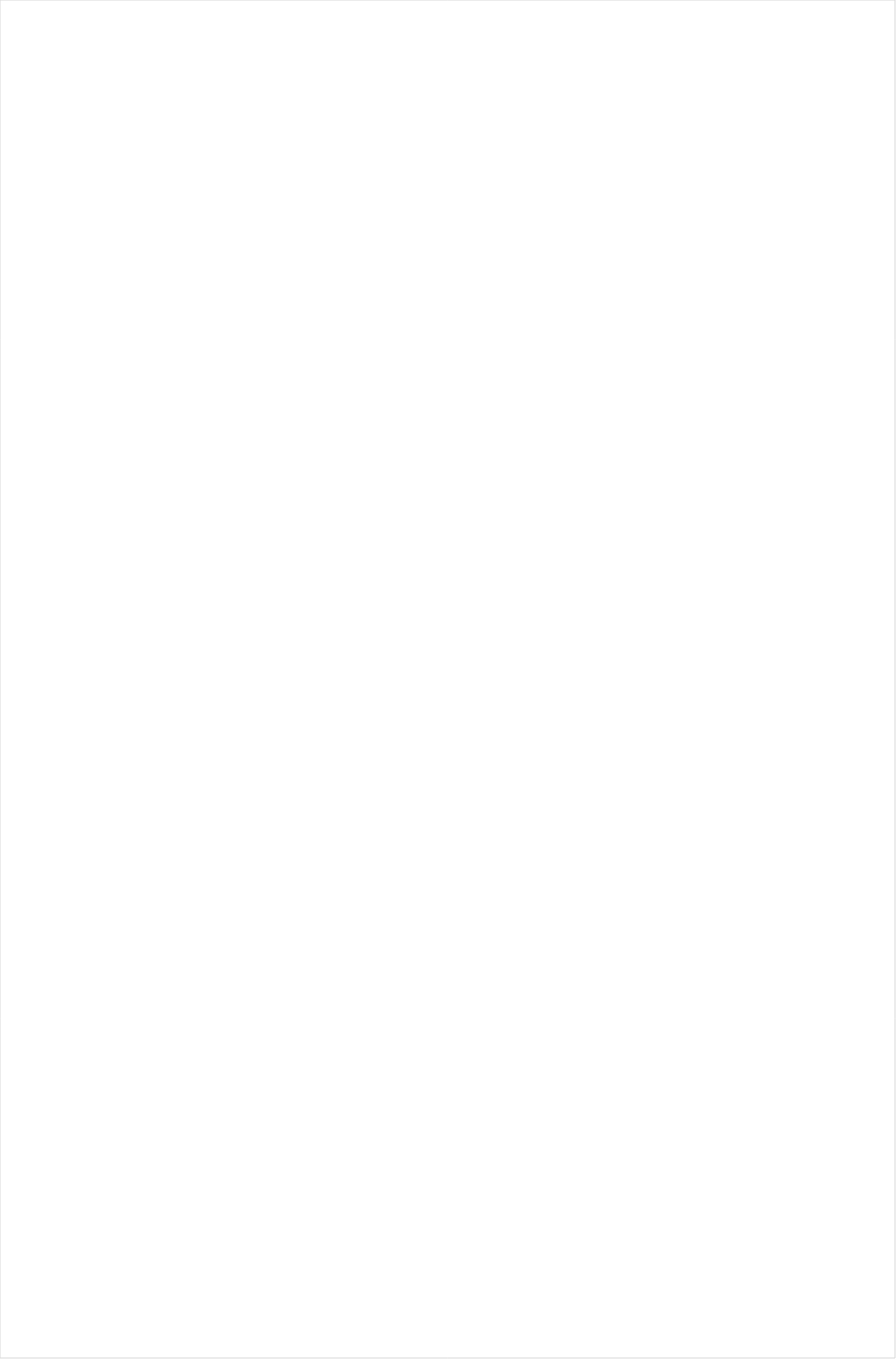
| Category | Total |
|---|---|
| Galavision | -0.847 |
| UniMas | -0.836 |
| TUDN | -0.761 |
| Telemundo | -0.749 |
| ESPN Deportes | -0.686 |
| Univision | -0.559 |
| NBC Universo | -0.513 |
| Cartoon Network | -0.419 |
| Travel | -0.263 |
| Adult Swim | -0.248 |
| Discovery Life Channel | -0.245 |
| Nick Toons | -0.224 |
| Lifetime Movies | -0.185 |
| Nick | -0.174 |
| Disney Channel | -0.165 |
| Investigation Discovery | -0.154 |
| Disney XD | -0.145 |
| TLC | -0.138 |
| INSP | -0.136 |
| Hallmark Movies & Mysteries | -0.134 |
| UP TV | -0.133 |
| Nick Jr. | -0.123 |
| Teen Nick | -0.116 |
| OXYGEN | -0.115 |
| WE TV | -0.114 |
| Universal Kids | -0.111 |
| ION | -0.103 |
| Lifetime | -0.095 |
| Science Channel | -0.091 |
| Hallmark | -0.09 |
| VH1 | -0.088 |
| Oprah Winfrey Network | -0.08 |
| Nick@Nite | -0.072 |
| Disney Junior US | -0.072 |
| Headline News | -0.069 |
| BET | -0.032 |
| E! | -0.03 |
| Motor Trend Network | -0.029 |
| Animal Planet | -0.026 |
| MyNetworkTV | 0.008 |
| A&E | 0.01 |
| Discovery Family Channel | 0.023 |
| History Channel | 0.024 |
| RFD TV | 0.039 |
| SYFY | 0.042 |
| MTV | 0.051 |
| Great American Country | 0.056 |
| BET Her | 0.059 |
| TV ONE | 0.06 |
| National Geographic Wild | 0.06 |
| FYI | 0.061 |
| CW | 0.062 |
| CMTV | 0.066 |
| POP | 0.067 |
| Discovery Channel | 0.068 |
| BRAVO | 0.068 |
| Ovation | 0.081 |
| American Heroes Channel | 0.082 |
| FOX | 0.083 |
| TV LAND | 0.087 |
| USA Network | 0.088 |
| Freeform | 0.094 |
| Logo | 0.094 |
| Paramount Network | 0.101 |
| MTV2 | 0.105 |
| National Geographic | 0.109 |
| FX | 0.111 |
| FXDEP | 0.116 |
| Weather Channel | 0.122 |
| FX Movie Channel | 0.124 |
| MSNBC | 0.125 |
| HGTV | 0.132 |
| FXX | 0.132 |
| WGN America | 0.142 |
| PBS | 0.154 |
| Smithsonian | 0.157 |
| BBC America | 0.157 |
| Reelz Channel | 0.166 |
| ABC | 0.17 |
| Food Network | 0.17 |
| SundanceTV | 0.176 |
| Fox Business | 0.18 |
| TBS | 0.184 |
| truTV | 0.186 |
| NBC | 0.189 |
| Game Show | 0.19 |
| Fox News | 0.192 |
| TNT | 0.208 |
| Destination America | 0.215 |
| CNN | 0.234 |
| CBS | 0.234 |
| Outdoor Channel | 0.256 |
| DIY | 0.266 |
| AMC | 0.271 |
| Cooking Channel | 0.274 |
| CNBC | 0.281 |
| Independent Film (IFC) | 0.286 |
| Viceland | 0.296 |
| Bloomberg HD | 0.302 |
| Comedy Central | 0.338 |
| The Sportsman Channel | 0.383 |
| NBC Sports | 0.387 |
| Tennis Channel | 0.581 |
| NHL | 0.821 |
| Fox Sports 1 | 0.844 |
| PAC-12 Network | 0.861 |
| NFL Network | 0.876 |
| Golf | 0.95 |
| MLB Network | 0.993 |
| ESPNEWS | 0.993 |
| Olympic Channel | 1.033 |
| CBS Sports | 1.034 |
| NBA TV | 1.09 |
| ESPN | 1.153 |
| ESPN2 | 1.203 |
| ESPNU | 1.218 |
| Big Ten Network | 1.474 |